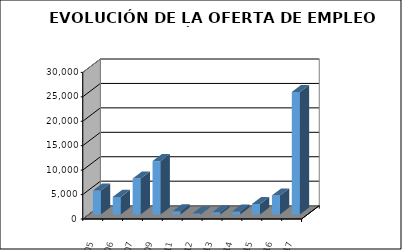
| Category | Series 0 |
|---|---|
| 2005.0 | 4895 |
| 2006.0 | 3604 |
| 2007.0 | 7362 |
| 2009.0 | 10934 |
| 2011.0 | 645 |
| 2012.0 | 190 |
| 2013.0 | 449 |
| 2014.0 | 624 |
| 2015.0 | 2163 |
| 2016.0 | 3907 |
| 2017.0 | 25072 |